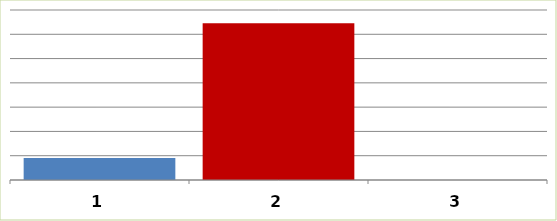
| Category | Series 0 |
|---|---|
| 0 | 9044451.75 |
| 1 | 64545577 |
| 2 | 0 |